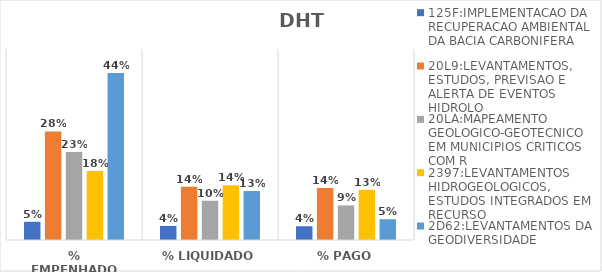
| Category | 125F:IMPLEMENTACAO DA RECUPERACAO AMBIENTAL DA BACIA CARBONIFERA | 20L9:LEVANTAMENTOS, ESTUDOS, PREVISAO E ALERTA DE EVENTOS HIDROLO | 20LA:MAPEAMENTO GEOLOGICO-GEOTECNICO EM MUNICIPIOS CRITICOS COM R | 2397:LEVANTAMENTOS HIDROGEOLOGICOS, ESTUDOS INTEGRADOS EM RECURSO | 2D62:LEVANTAMENTOS DA GEODIVERSIDADE |
|---|---|---|---|---|---|
| % EMPENHADO | 0.048 | 0.284 | 0.23 | 0.181 | 0.437 |
| % LIQUIDADO | 0.037 | 0.139 | 0.103 | 0.143 | 0.128 |
| % PAGO | 0.036 | 0.136 | 0.09 | 0.131 | 0.054 |